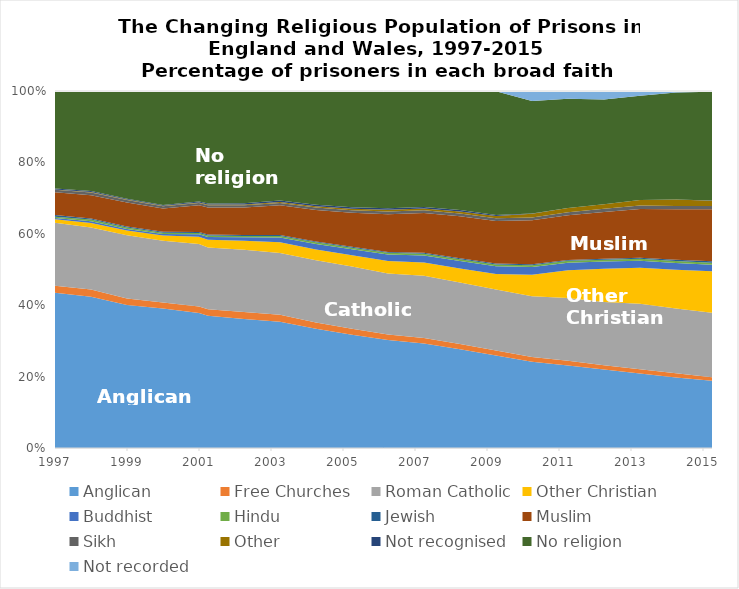
| Category | Anglican | Free Churches | Roman Catholic | Other Christian | Buddhist | Hindu | Jewish | Muslim | Sikh | Other | Not recognised | No religion | Not recorded |
|---|---|---|---|---|---|---|---|---|---|---|---|---|---|
| 1997-03-01 | 43.51 | 1.93 | 17.661 | 0.947 | 0.39 | 0.342 | 0.497 | 6.35 | 0.68 | 0.136 | 0.233 | 27.324 | 0 |
| 1998-03-01 | 42.353 | 2.074 | 17.333 | 1.243 | 0.503 | 0.472 | 0.332 | 6.497 | 0.762 | 0.147 | 0.247 | 28.038 | 0 |
| 1999-03-01 | 40.063 | 1.803 | 17.732 | 1.297 | 0.477 | 0.378 | 0.299 | 6.718 | 0.696 | 0.143 | 0.224 | 30.167 | 0.005 |
| 2000-03-01 | 39.056 | 1.729 | 17.303 | 1.404 | 0.435 | 0.376 | 0.244 | 6.566 | 0.602 | 0.136 | 0.232 | 31.908 | 0.011 |
| 2001-03-01 | 37.802 | 1.835 | 17.486 | 2.037 | 0.687 | 0.408 | 0.254 | 7.466 | 0.633 | 0.171 | 0.283 | 30.922 | 0.017 |
| 2001-06-01 | 37.045 | 1.797 | 17.326 | 2.194 | 0.732 | 0.441 | 0.239 | 7.599 | 0.649 | 0.202 | 0.273 | 31.485 | 0.018 |
| 2002-06-01 | 36.159 | 1.966 | 17.38 | 2.546 | 0.949 | 0.381 | 0.251 | 7.726 | 0.621 | 0.236 | 0.313 | 31.46 | 0.014 |
| 2003-06-01 | 35.373 | 1.925 | 17.31 | 3.04 | 1.286 | 0.46 | 0.25 | 8.331 | 0.665 | 0.281 | 0.402 | 30.661 | 0.018 |
| 2004-06-01 | 33.408 | 1.744 | 17.431 | 3.047 | 1.521 | 0.459 | 0.243 | 8.822 | 0.669 | 0.379 | 0.435 | 31.829 | 0.013 |
| 2005-06-01 | 31.721 | 1.651 | 17.462 | 3.182 | 1.624 | 0.486 | 0.259 | 9.51 | 0.713 | 0.399 | 0.406 | 32.584 | 0.004 |
| 2006-06-01 | 30.251 | 1.53 | 17.107 | 3.466 | 1.836 | 0.472 | 0.24 | 10.57 | 0.742 | 0.509 | 0.449 | 32.826 | 0.003 |
| 2007-06-01 | 29.289 | 1.535 | 17.448 | 3.66 | 2.018 | 0.448 | 0.29 | 11.117 | 0.763 | 0.525 | 0.423 | 32.483 | 0.005 |
| 2008-06-01 | 27.693 | 1.458 | 17.184 | 3.956 | 2.088 | 0.522 | 0.264 | 11.774 | 0.779 | 0.539 | 0.417 | 33.308 | 0.02 |
| 2009-06-01 | 25.889 | 1.422 | 17.09 | 4.329 | 2.157 | 0.525 | 0.261 | 11.925 | 0.773 | 0.59 | 0.338 | 34.627 | 0.074 |
| 2010-06-01 | 24.148 | 1.349 | 16.984 | 6.019 | 2.202 | 0.512 | 0.274 | 12.279 | 0.787 | 1.072 | 0.028 | 31.564 | 2.782 |
| 2011-06-01 | 23.09 | 1.331 | 17.571 | 7.802 | 2.1 | 0.529 | 0.267 | 12.5 | 0.833 | 1.183 | 0.02 | 30.587 | 2.187 |
| 2012-06-01 | 21.962 | 1.217 | 17.708 | 9.29 | 2.041 | 0.53 | 0.293 | 13.072 | 0.903 | 1.23 | 0.022 | 29.366 | 2.367 |
| 2013-06-01 | 20.892 | 1.195 | 18.329 | 10.086 | 1.954 | 0.538 | 0.32 | 13.628 | 0.953 | 1.56 | 0.017 | 29.203 | 1.327 |
| 2014-06-01 | 19.732 | 1.194 | 18.168 | 10.849 | 1.905 | 0.523 | 0.373 | 14.158 | 0.856 | 1.83 | 0.033 | 29.961 | 0.419 |
| 2015-06-01 | 18.83 | 0.999 | 18.057 | 11.629 | 1.805 | 0.552 | 0.432 | 14.552 | 0.914 | 1.516 | 0.012 | 30.494 | 0.208 |